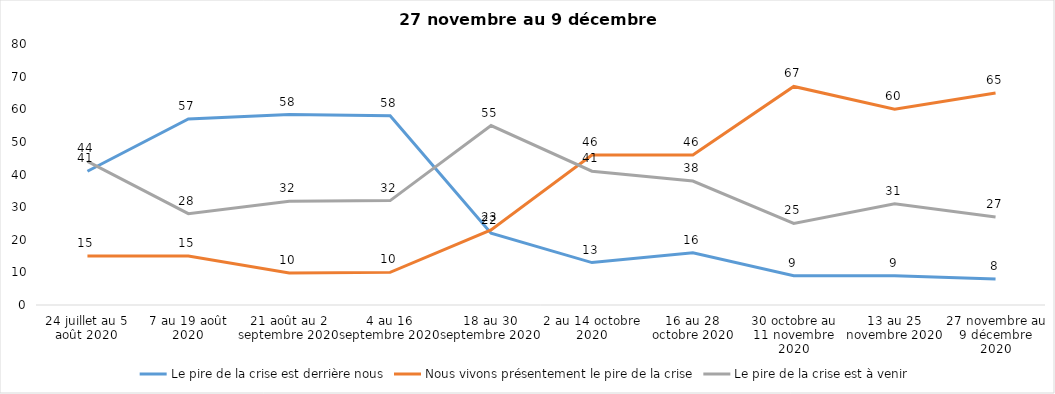
| Category | Le pire de la crise est derrière nous | Nous vivons présentement le pire de la crise | Le pire de la crise est à venir |
|---|---|---|---|
| 24 juillet au 5 août 2020 | 41 | 15 | 44 |
| 7 au 19 août 2020 | 57 | 15 | 28 |
| 21 août au 2 septembre 2020 | 58.39 | 9.84 | 31.77 |
| 4 au 16 septembre 2020 | 58 | 10 | 32 |
| 18 au 30 septembre 2020 | 22 | 23 | 55 |
| 2 au 14 octobre 2020 | 13 | 46 | 41 |
| 16 au 28 octobre 2020 | 16 | 46 | 38 |
| 30 octobre au 11 novembre 2020 | 9 | 67 | 25 |
| 13 au 25 novembre 2020 | 9 | 60 | 31 |
| 27 novembre au 9 décembre 2020 | 8 | 65 | 27 |